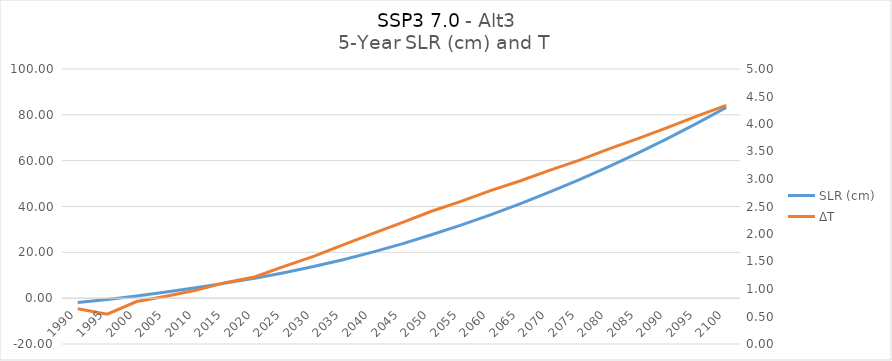
| Category | SLR (cm) |
|---|---|
| 1990.0 | -1.853 |
| 1995.0 | -0.626 |
| 2000.0 | 0.958 |
| 2005.0 | 2.678 |
| 2010.0 | 4.531 |
| 2015.0 | 6.565 |
| 2020.0 | 8.703 |
| 2025.0 | 11.118 |
| 2030.0 | 13.794 |
| 2035.0 | 16.788 |
| 2040.0 | 20.096 |
| 2045.0 | 23.713 |
| 2050.0 | 27.654 |
| 2055.0 | 31.864 |
| 2060.0 | 36.38 |
| 2065.0 | 41.16 |
| 2070.0 | 46.239 |
| 2075.0 | 51.6 |
| 2080.0 | 57.291 |
| 2085.0 | 63.279 |
| 2090.0 | 69.59 |
| 2095.0 | 76.246 |
| 2100.0 | 83.219 |